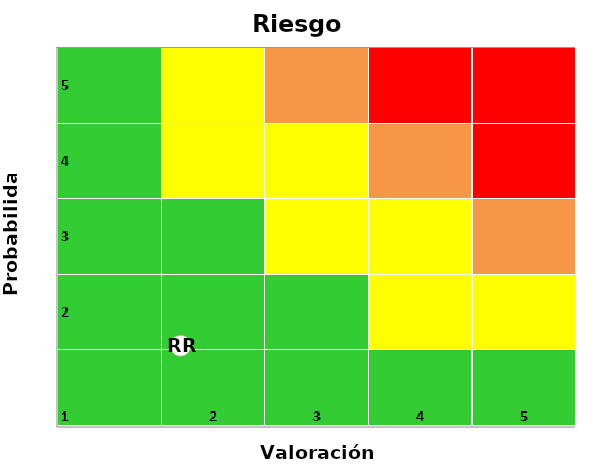
| Category | RR |
|---|---|
| 1.6923076923076923 | 1.569 |